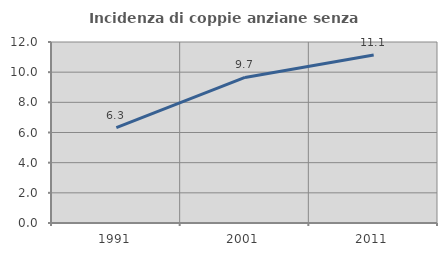
| Category | Incidenza di coppie anziane senza figli  |
|---|---|
| 1991.0 | 6.32 |
| 2001.0 | 9.652 |
| 2011.0 | 11.134 |